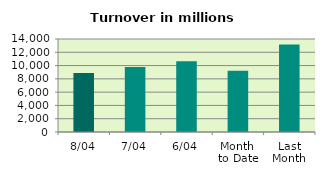
| Category | Series 0 |
|---|---|
| 8/04 | 8900.512 |
| 7/04 | 9782.821 |
| 6/04 | 10658.843 |
| Month 
to Date | 9238.928 |
| Last
Month | 13160.868 |